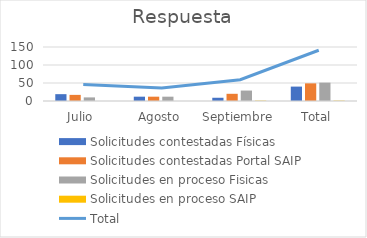
| Category | Solicitudes contestadas Físicas | Solicitudes contestadas Portal SAIP | Solicitudes en proceso Fisicas | Solicitudes en proceso SAIP |
|---|---|---|---|---|
| Julio | 19 | 17 | 10 | 0 |
| Agosto | 12 | 12 | 12 | 0 |
| Septiembre | 9 | 20 | 29 | 1 |
| Total | 40 | 49 | 51 | 1 |